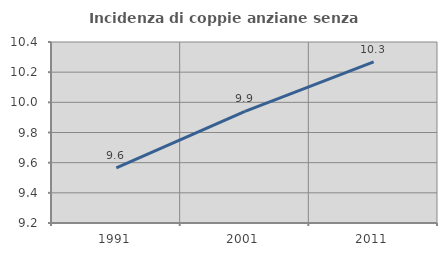
| Category | Incidenza di coppie anziane senza figli  |
|---|---|
| 1991.0 | 9.566 |
| 2001.0 | 9.94 |
| 2011.0 | 10.268 |